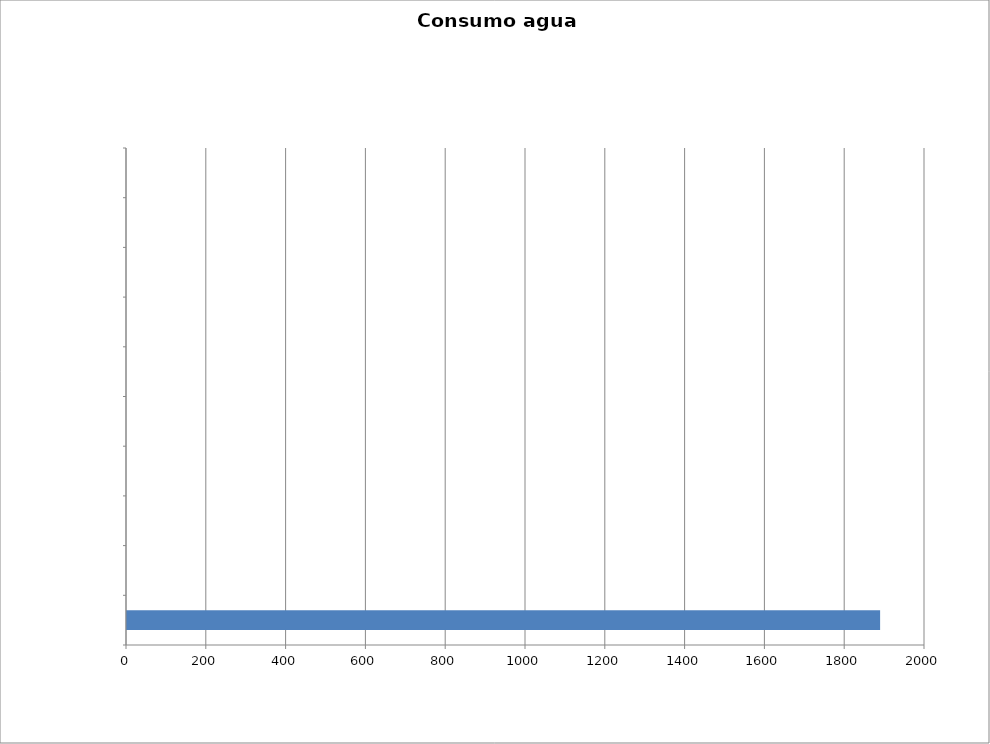
| Category | Series 0 |
|---|---|
| 0 | 1887.5 |
| 1 | 0 |
| 2 | 0 |
| 3 | 0 |
| 4 | 0 |
| 5 | 0 |
| 6 | 0 |
| 7 | 0 |
| 8 | 0 |
| 9 | 0 |